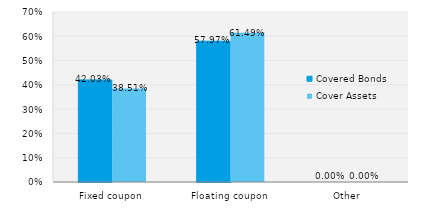
| Category | Covered Bonds | Cover Assets |
|---|---|---|
| Fixed coupon | 0.42 | 0.385 |
| Floating coupon | 0.58 | 0.615 |
| Other | 0 | 0 |